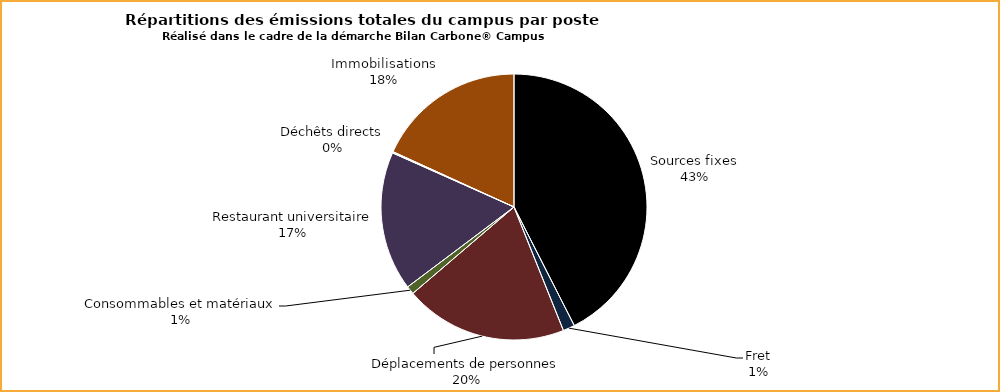
| Category | Series 0 |
|---|---|
| Sources fixes | 0.425 |
| Fret | 0.014 |
| Déplacements de personnes | 0.198 |
| Consommables et matériaux | 0.01 |
| Restaurant universitaire | 0.169 |
| Déchêts directs | 0.002 |
| Immobilisations | 0.182 |